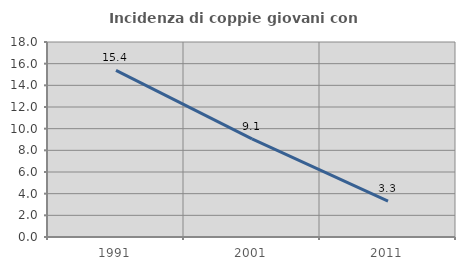
| Category | Incidenza di coppie giovani con figli |
|---|---|
| 1991.0 | 15.385 |
| 2001.0 | 9.056 |
| 2011.0 | 3.311 |